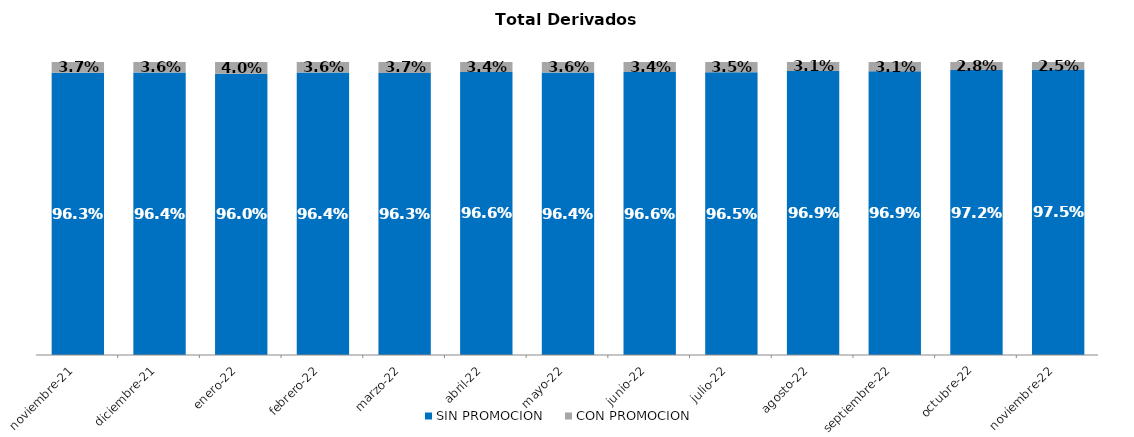
| Category | SIN PROMOCION   | CON PROMOCION   |
|---|---|---|
| 2021-11-01 | 0.963 | 0.037 |
| 2021-12-01 | 0.964 | 0.036 |
| 2022-01-01 | 0.96 | 0.04 |
| 2022-02-01 | 0.964 | 0.036 |
| 2022-03-01 | 0.963 | 0.037 |
| 2022-04-01 | 0.966 | 0.034 |
| 2022-05-01 | 0.964 | 0.036 |
| 2022-06-01 | 0.966 | 0.034 |
| 2022-07-01 | 0.965 | 0.035 |
| 2022-08-01 | 0.969 | 0.031 |
| 2022-09-01 | 0.969 | 0.031 |
| 2022-10-01 | 0.972 | 0.028 |
| 2022-11-01 | 0.975 | 0.025 |